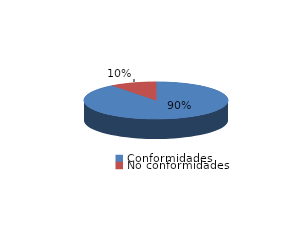
| Category | Series 0 |
|---|---|
| Conformidades | 2326 |
| No conformidades | 269 |